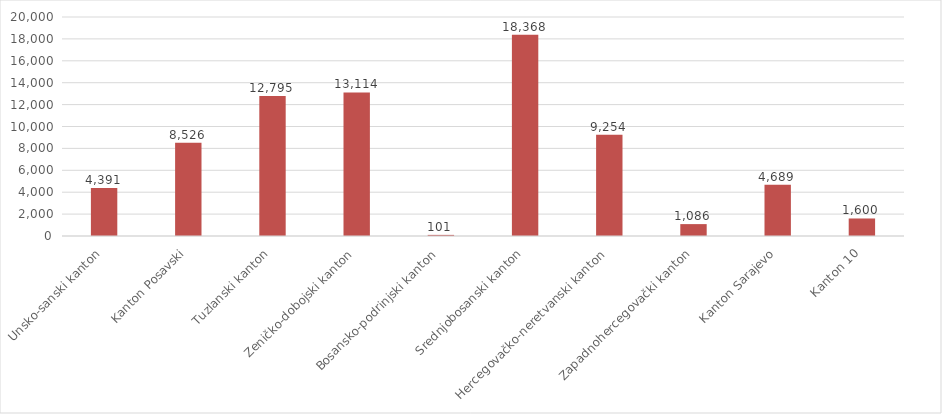
| Category | Series 1 |
|---|---|
| Unsko-sanski kanton | 4391 |
| Kanton Posavski | 8526 |
| Tuzlanski kanton | 12795 |
| Zeničko-dobojski kanton | 13114 |
| Bosansko-podrinjski kanton | 101 |
| Srednjobosanski kanton | 18368 |
| Hercegovačko-neretvanski kanton | 9254 |
| Zapadnohercegovački kanton | 1086 |
| Kanton Sarajevo | 4689 |
| Kanton 10 | 1600 |